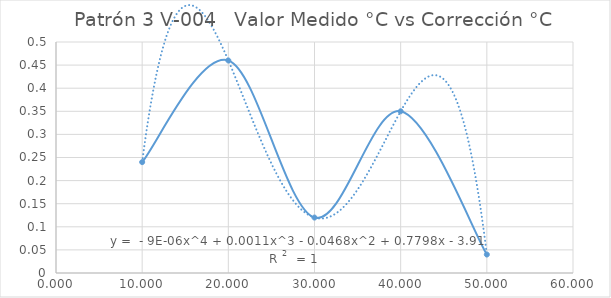
| Category | Patrón 3 V-004 |
|---|---|
| 10.0 | 0.24 |
| 20.0 | 0.46 |
| 30.0 | 0.12 |
| 40.0 | 0.35 |
| 50.0 | 0.04 |